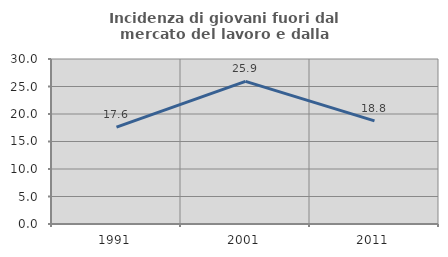
| Category | Incidenza di giovani fuori dal mercato del lavoro e dalla formazione  |
|---|---|
| 1991.0 | 17.619 |
| 2001.0 | 25.926 |
| 2011.0 | 18.75 |